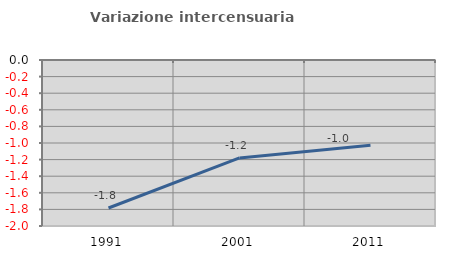
| Category | Variazione intercensuaria annua |
|---|---|
| 1991.0 | -1.783 |
| 2001.0 | -1.18 |
| 2011.0 | -1.026 |